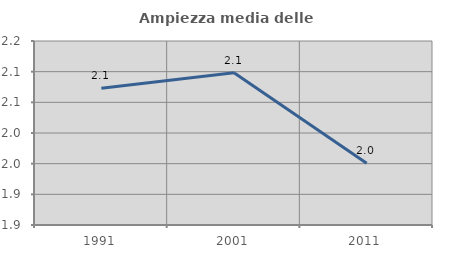
| Category | Ampiezza media delle famiglie |
|---|---|
| 1991.0 | 2.073 |
| 2001.0 | 2.098 |
| 2011.0 | 1.951 |